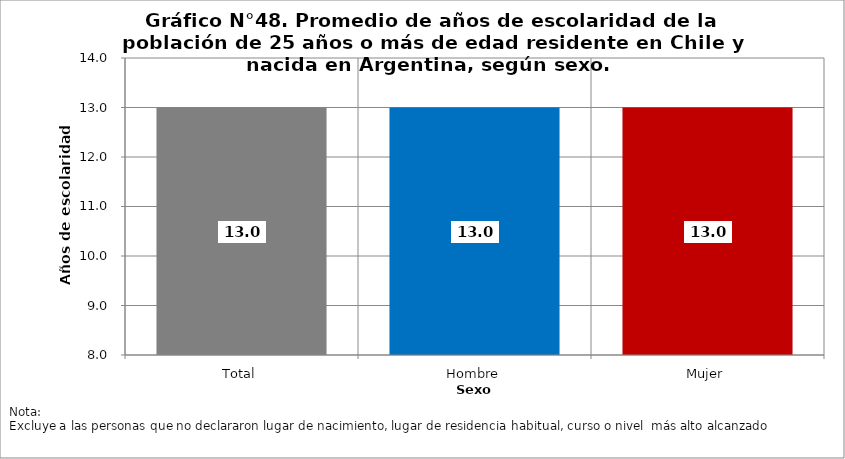
| Category | Series 0 |
|---|---|
| Total | 13 |
| Hombre | 13 |
| Mujer | 13 |